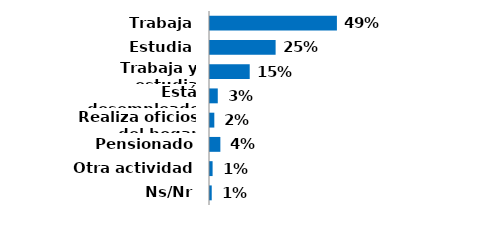
| Category | Series 0 |
|---|---|
| Trabaja | 0.49 |
| Estudia | 0.253 |
| Trabaja y estudia | 0.153 |
| Está desempleado | 0.03 |
| Realiza oficios del hogar | 0.017 |
| Pensionado | 0.04 |
| Otra actividad | 0.01 |
| Ns/Nr | 0.007 |